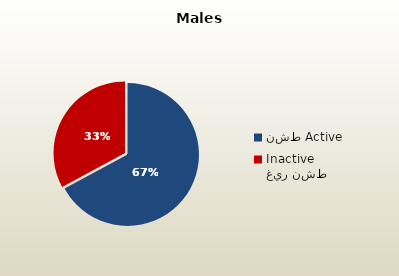
| Category | الذكور القطريين  Qatari Males |
|---|---|
| نشط Active | 68854 |
| غير نشط Inactive | 33715 |